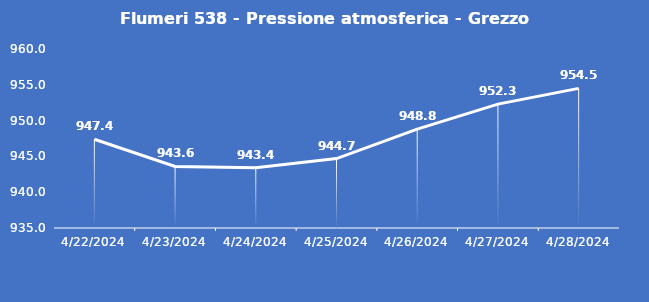
| Category | Flumeri 538 - Pressione atmosferica - Grezzo (hPa) |
|---|---|
| 4/22/24 | 947.4 |
| 4/23/24 | 943.6 |
| 4/24/24 | 943.4 |
| 4/25/24 | 944.7 |
| 4/26/24 | 948.8 |
| 4/27/24 | 952.3 |
| 4/28/24 | 954.5 |